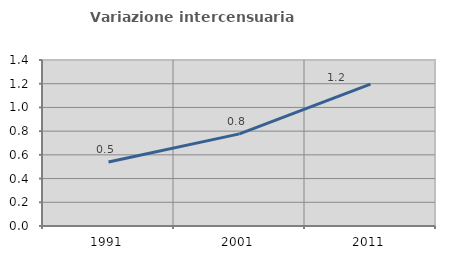
| Category | Variazione intercensuaria annua |
|---|---|
| 1991.0 | 0.54 |
| 2001.0 | 0.777 |
| 2011.0 | 1.196 |